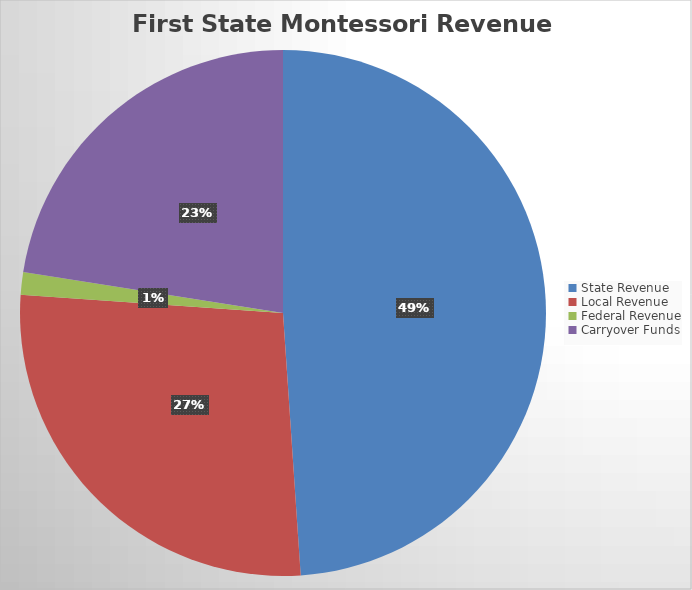
| Category | Series 0 |
|---|---|
| State Revenue | 5879581 |
| Local Revenue | 3265020.71 |
| Federal Revenue | 167344 |
| Carryover Funds | 2704941.32 |